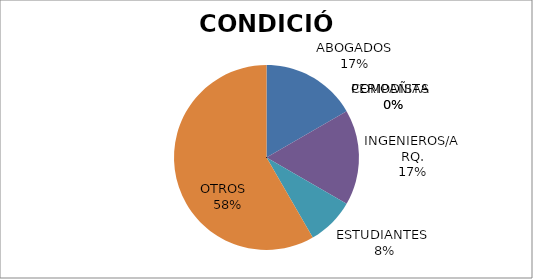
| Category | Series 0 |
|---|---|
| ABOGADOS | 2 |
| PERIODISTA  | 0 |
| COMPAÑIAS  | 0 |
| INGENIEROS/ARQ. | 2 |
| ESTUDIANTES  | 1 |
| OTROS   | 7 |